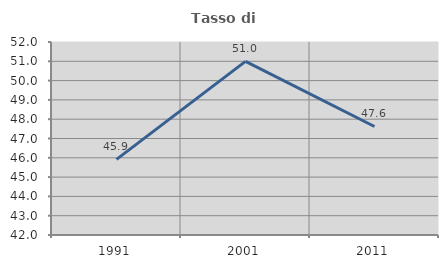
| Category | Tasso di occupazione   |
|---|---|
| 1991.0 | 45.918 |
| 2001.0 | 50.996 |
| 2011.0 | 47.622 |